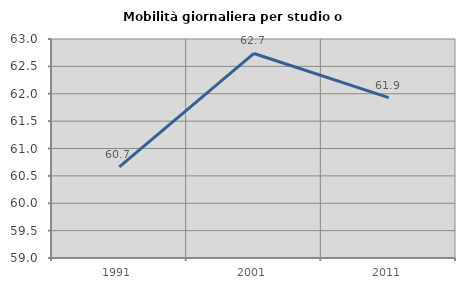
| Category | Mobilità giornaliera per studio o lavoro |
|---|---|
| 1991.0 | 60.664 |
| 2001.0 | 62.736 |
| 2011.0 | 61.929 |